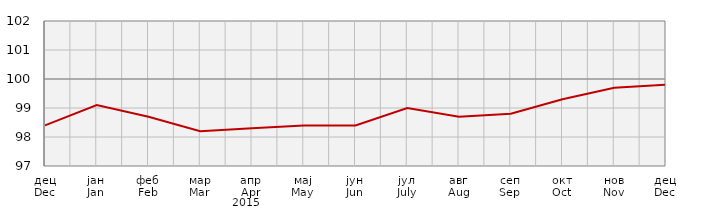
| Category | Индекси потрошачких цијена
Consumer price indices |
|---|---|
| дец
Dec | 98.4 |
| јан
Jan | 99.1 |
| феб
Feb | 98.7 |
| мар
Mar | 98.2 |
| апр
Apr | 98.3 |
| мај
May | 98.4 |
| јун
Jun | 98.4 |
| јул
July | 99 |
| авг
Aug | 98.7 |
| сеп
Sep | 98.8 |
| окт
Oct | 99.3 |
| нов
Nov | 99.7 |
| дец
Dec | 99.8 |